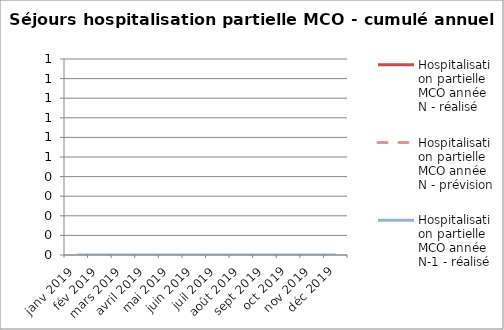
| Category | Hospitalisation partielle MCO année N - réalisé | Hospitalisation partielle MCO année N - prévision | Hospitalisation partielle MCO année N-1 - réalisé |
|---|---|---|---|
| janv 2019 |  |  | 0 |
| fév 2019 |  |  | 0 |
| mars 2019 |  |  | 0 |
| avril 2019 |  |  | 0 |
| mai 2019 |  |  | 0 |
| juin 2019 |  |  | 0 |
| juil 2019 |  |  | 0 |
| août 2019 |  |  | 0 |
| sept 2019 |  |  | 0 |
| oct 2019 |  |  | 0 |
| nov 2019 |  |  | 0 |
| déc 2019 |  |  | 0 |